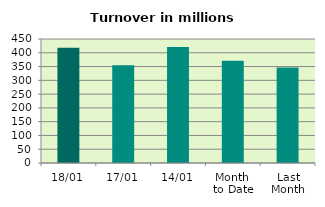
| Category | Series 0 |
|---|---|
| 18/01 | 418.687 |
| 17/01 | 354.479 |
| 14/01 | 420.906 |
| Month 
to Date | 371.484 |
| Last
Month | 346.191 |